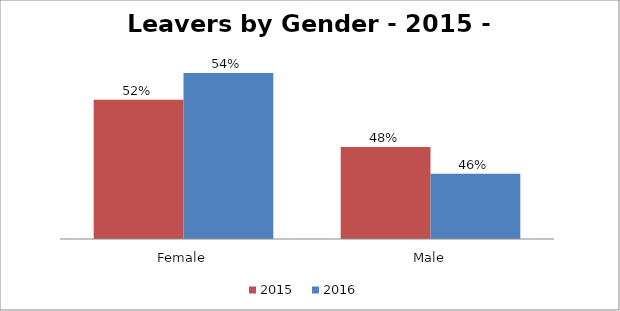
| Category | 2015
 | 2016
 |
|---|---|---|
| Female | 0.52 | 0.543 |
| Male | 0.48 | 0.457 |